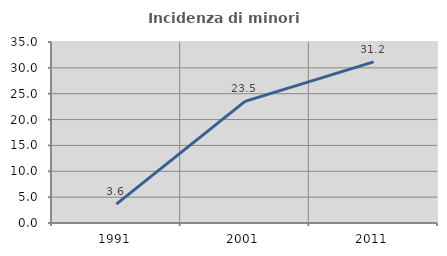
| Category | Incidenza di minori stranieri |
|---|---|
| 1991.0 | 3.636 |
| 2001.0 | 23.529 |
| 2011.0 | 31.157 |